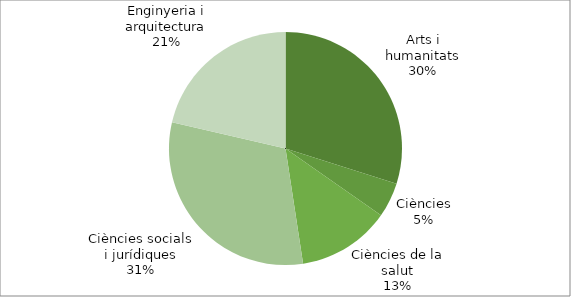
| Category | Arts i humanitats |
|---|---|
| Arts i humanitats | 130 |
| Ciències | 21 |
| Ciències de la salut | 56 |
| Ciències socials i jurídiques | 135 |
| Enginyeria i arquitectura | 93 |